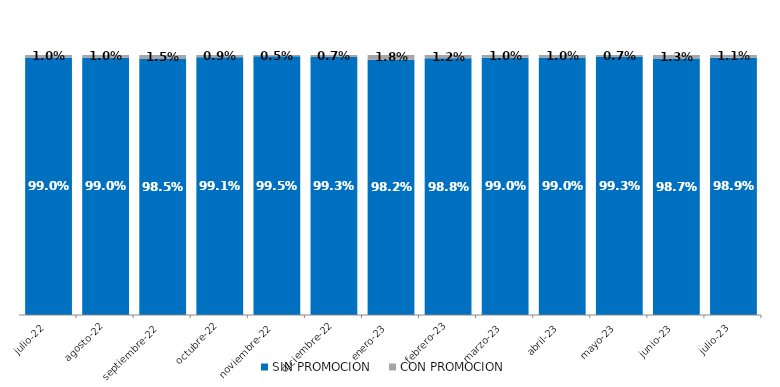
| Category | SIN PROMOCION   | CON PROMOCION   |
|---|---|---|
| 2022-07-01 | 0.99 | 0.01 |
| 2022-08-01 | 0.99 | 0.01 |
| 2022-09-01 | 0.985 | 0.015 |
| 2022-10-01 | 0.991 | 0.009 |
| 2022-11-01 | 0.995 | 0.005 |
| 2022-12-01 | 0.993 | 0.007 |
| 2023-01-01 | 0.982 | 0.018 |
| 2023-02-01 | 0.988 | 0.012 |
| 2023-03-01 | 0.99 | 0.01 |
| 2023-04-01 | 0.99 | 0.01 |
| 2023-05-01 | 0.993 | 0.007 |
| 2023-06-01 | 0.987 | 0.013 |
| 2023-07-01 | 0.989 | 0.011 |